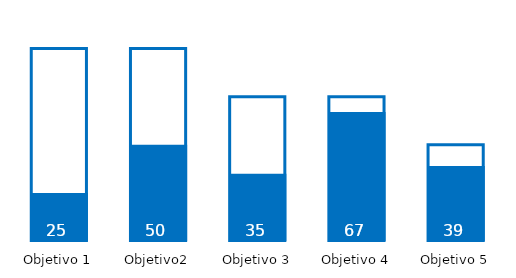
| Category | Series 0 | Series 1 |
|---|---|---|
| Objetivo 1 | 100 | 25 |
| Objetivo2 | 100 | 50 |
| Objetivo 3 | 75 | 35 |
| Objetivo 4 | 75 | 67 |
| Objetivo 5 | 50 | 39 |